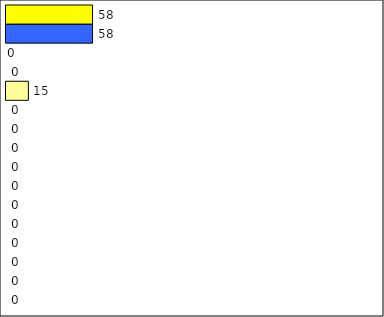
| Category | -2 | -1 | 0 | 1 | 2 | 3 | 4 | 5 | 6 | 7 | 8 | 9 | 10 | 11 | 12 | Perfect Round |
|---|---|---|---|---|---|---|---|---|---|---|---|---|---|---|---|---|
| 0 | 0 | 0 | 0 | 0 | 0 | 0 | 0 | 0 | 0 | 0 | 0 | 15 | 0 | 0 | 58 | 58 |